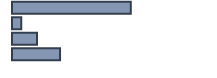
| Category | Percentatge |
|---|---|
| 0 | 59.1 |
| 1 | 4.6 |
| 2 | 12.4 |
| 3 | 23.9 |